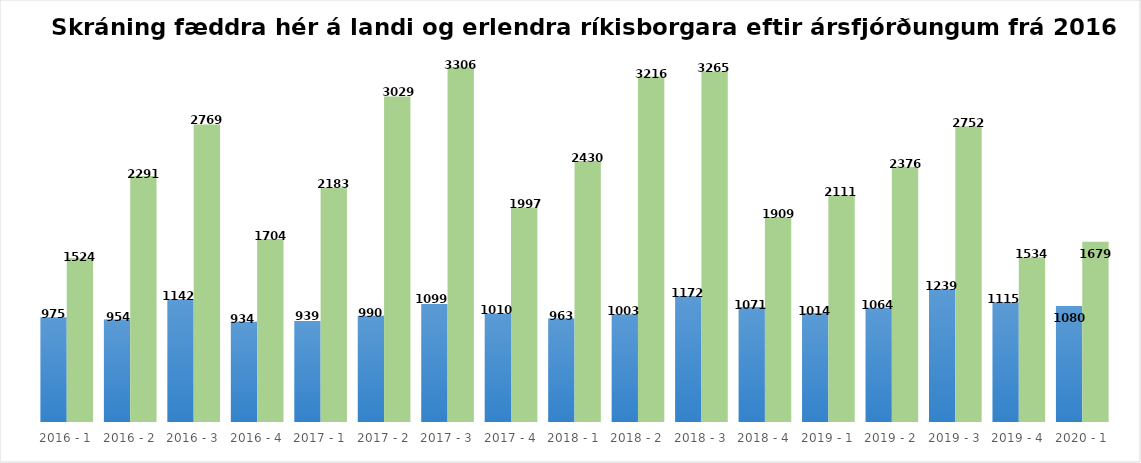
| Category | Skráning fæddra | Skráning erlendra |
|---|---|---|
| 2016 - 1 | 975 | 1524 |
| 2016 - 2 | 954 | 2291 |
| 2016 - 3 | 1142 | 2769 |
| 2016 - 4 | 934 | 1704 |
| 2017 - 1 | 939 | 2183 |
| 2017 - 2 | 990 | 3029 |
| 2017 - 3 | 1099 | 3306 |
| 2017 - 4 | 1010 | 1997 |
| 2018 - 1 | 963 | 2430 |
| 2018 - 2 | 1003 | 3216 |
| 2018 - 3 | 1172 | 3265 |
| 2018 - 4 | 1071 | 1909 |
| 2019 - 1 | 1014 | 2111 |
| 2019 - 2 | 1064 | 2376 |
| 2019 - 3 | 1239 | 2752 |
| 2019 - 4 | 1115 | 1534 |
| 2020 - 1 | 1080 | 1679 |